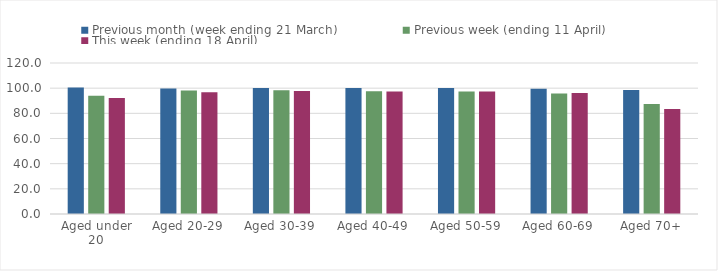
| Category | Previous month (week ending 21 March) | Previous week (ending 11 April) | This week (ending 18 April) |
|---|---|---|---|
| Aged under 20 | 100.502 | 93.974 | 92.137 |
| Aged 20-29 | 99.772 | 98.2 | 96.796 |
| Aged 30-39 | 100.04 | 98.303 | 97.729 |
| Aged 40-49 | 100.169 | 97.531 | 97.288 |
| Aged 50-59 | 100.166 | 97.419 | 97.398 |
| Aged 60-69 | 99.533 | 95.751 | 96.07 |
| Aged 70+ | 98.449 | 87.417 | 83.446 |